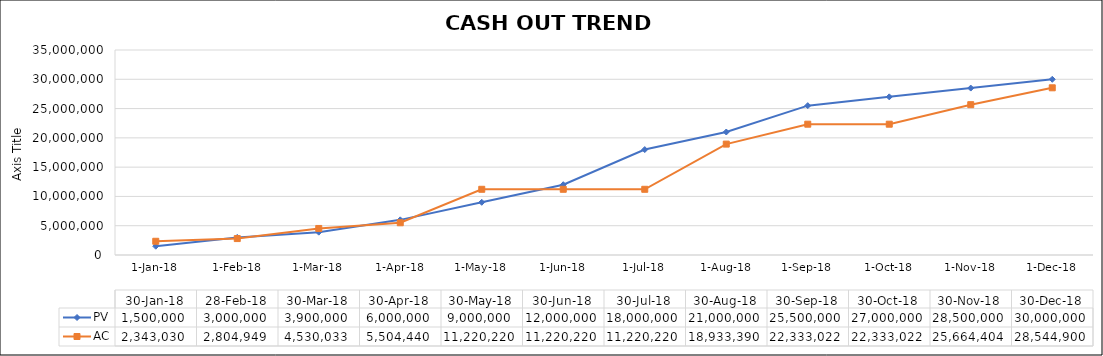
| Category | PV | AC  |
|---|---|---|
| 2018-01-30 | 1500000 | 2343030 |
| 2018-02-28 | 3000000 | 2804949 |
| 2018-03-30 | 3900000 | 4530033 |
| 2018-04-30 | 6000000 | 5504440 |
| 2018-05-30 | 9000000 | 11220220 |
| 2018-06-30 | 12000000 | 11220220 |
| 2018-07-30 | 18000000 | 11220220 |
| 2018-08-30 | 21000000 | 18933390 |
| 2018-09-30 | 25500000 | 22333022 |
| 2018-10-30 | 27000000 | 22333022 |
| 2018-11-30 | 28500000 | 25664404 |
| 2018-12-30 | 30000000 | 28544900 |